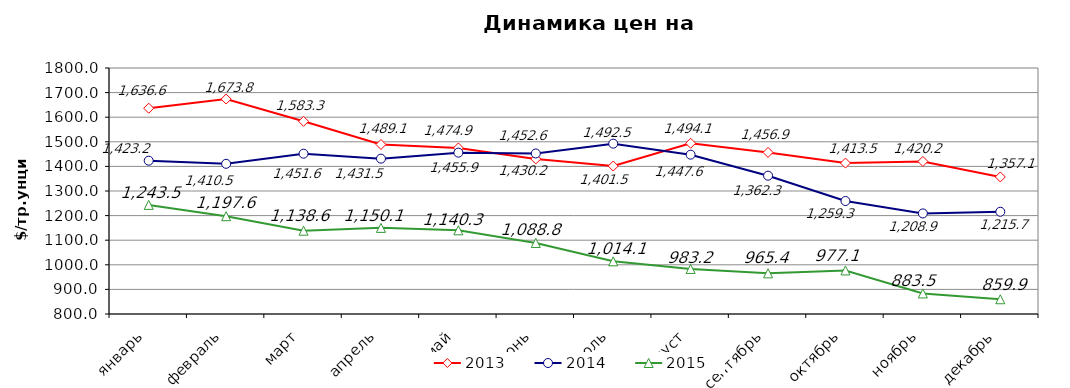
| Category | 2013 | 2014 | 2015 |
|---|---|---|---|
| январь | 1636.57 | 1423.18 | 1243.48 |
| февраль | 1673.75 | 1410.5 | 1197.6 |
| март | 1583.3 | 1451.62 | 1138.64 |
| апрель | 1489.12 | 1431.5 | 1150.1 |
| май | 1474.9 | 1455.89 | 1140.26 |
| июнь | 1430.23 | 1452.57 | 1088.77 |
| июль | 1401.48 | 1492.48 | 1014.09 |
| август | 1494.1 | 1447.64 | 983.15 |
| сентябрь | 1456.86 | 1362.29 | 965.36 |
| октябрь | 1413.48 | 1259.34 | 977.09 |
| ноябрь | 1420.19 | 1208.85 | 883.52 |
| декабрь | 1357.1 | 1215.67 | 859.9 |